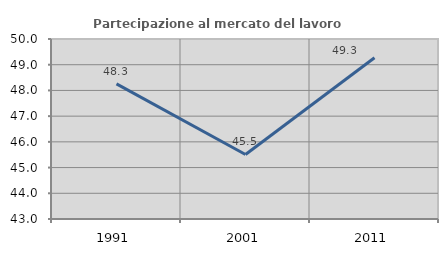
| Category | Partecipazione al mercato del lavoro  femminile |
|---|---|
| 1991.0 | 48.254 |
| 2001.0 | 45.509 |
| 2011.0 | 49.271 |